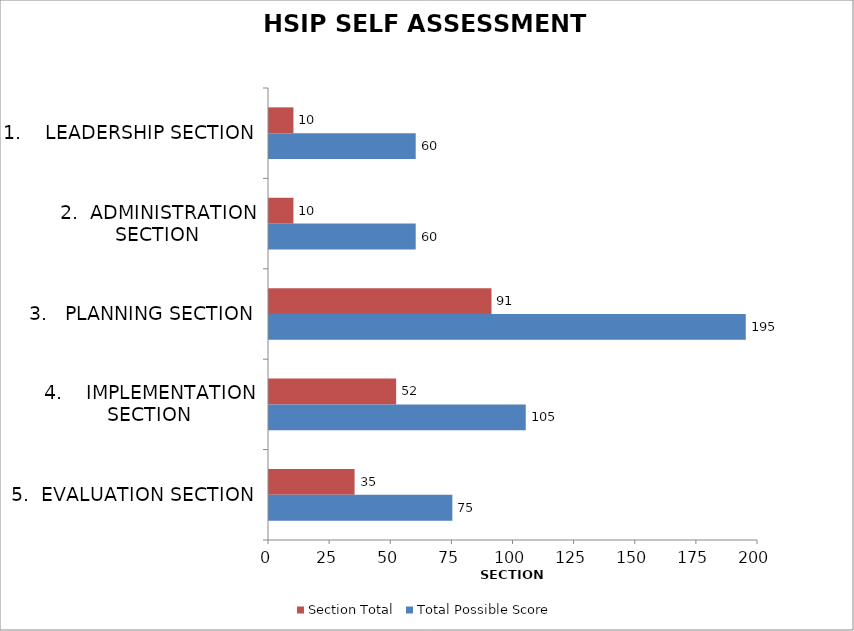
| Category | Section Total | Total Possible Score |
|---|---|---|
| 1.    LEADERSHIP SECTION | 10 | 60 |
| 2.  ADMINISTRATION SECTION | 10 | 60 |
| 3.   PLANNING SECTION | 91 | 195 |
| 4.    IMPLEMENTATION SECTION | 52 | 105 |
| 5.  EVALUATION SECTION | 35 | 75 |